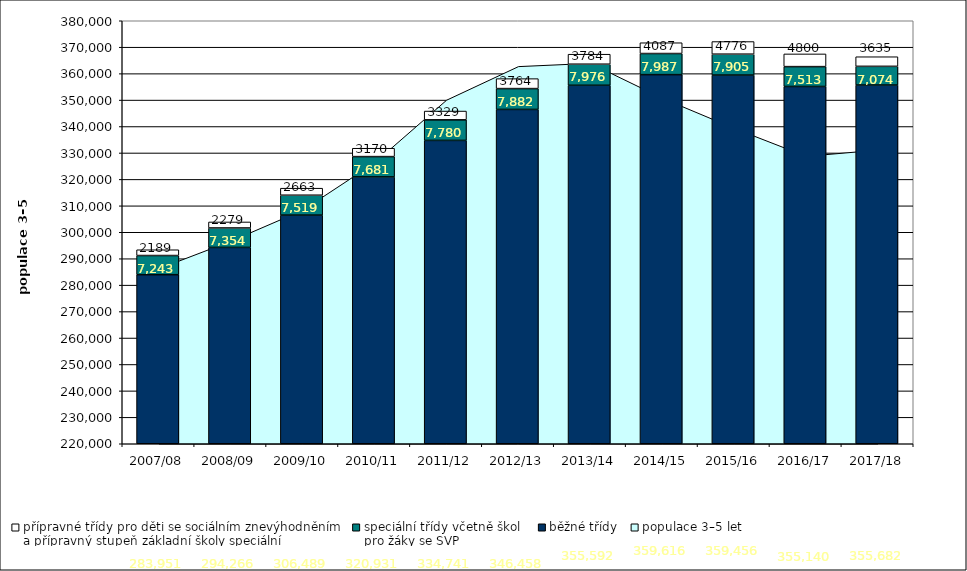
| Category | běžné třídy | speciální třídy včetně škol
pro žáky se SVP | přípravné třídy pro děti se sociálním znevýhodněním
a přípravný stupeň základní školy speciální |
|---|---|---|---|
| 2007/08 | 283951 | 7243 | 2189 |
| 2008/09 | 294266 | 7354 | 2279 |
| 2009/10 | 306489 | 7519 | 2663 |
| 2010/11 | 320931 | 7681 | 3170 |
| 2011/12 | 334741 | 7780 | 3329 |
| 2012/13 | 346458 | 7882 | 3764 |
| 2013/14 | 355592 | 7976 | 3784 |
| 2014/15 | 359616 | 7987 | 4087 |
| 2015/16 | 359456 | 7905 | 4776 |
| 2016/17 | 355140 | 7513 | 4800 |
| 2017/18 | 355682 | 7074 | 3635 |